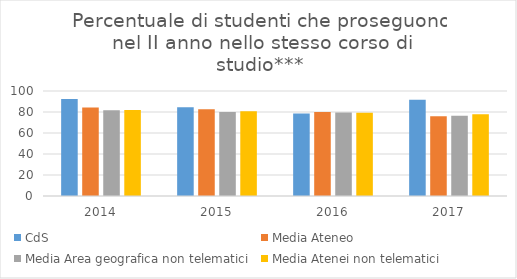
| Category | CdS | Media Ateneo | Media Area geografica non telematici | Media Atenei non telematici |
|---|---|---|---|---|
| 2014.0 | 92.3 | 84.2 | 81.7 | 82 |
| 2015.0 | 84.6 | 82.7 | 79.9 | 80.8 |
| 2016.0 | 78.6 | 80 | 79.6 | 79.4 |
| 2017.0 | 91.7 | 76 | 76.4 | 77.8 |